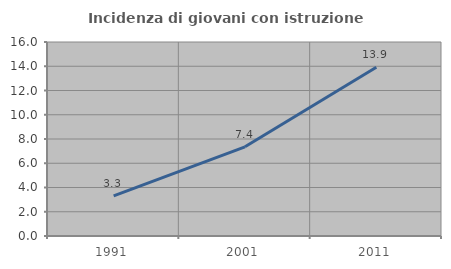
| Category | Incidenza di giovani con istruzione universitaria |
|---|---|
| 1991.0 | 3.312 |
| 2001.0 | 7.357 |
| 2011.0 | 13.916 |